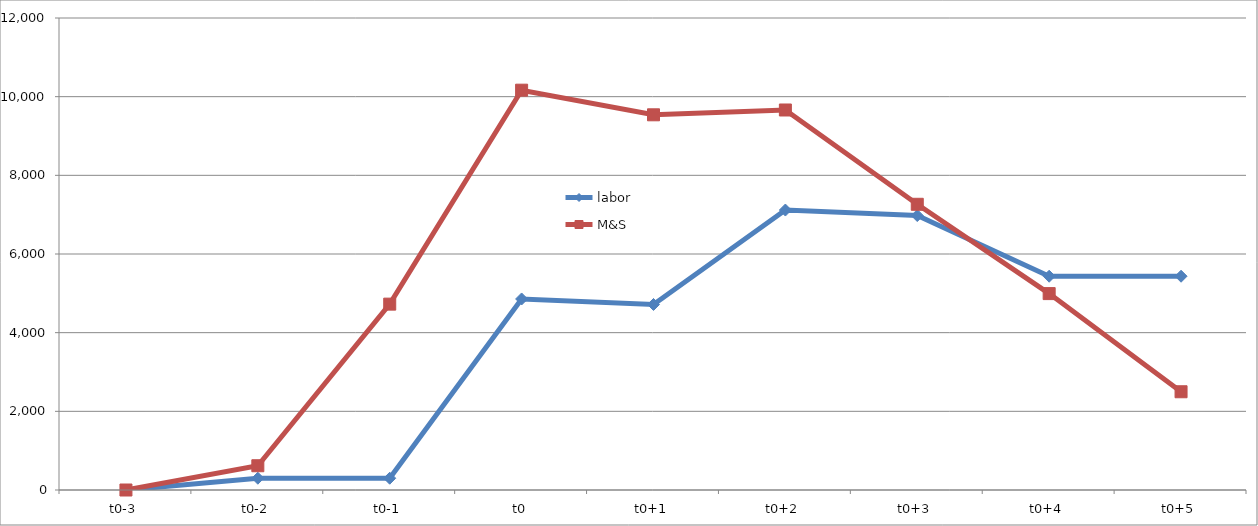
| Category | labor | M&S |
|---|---|---|
| t0-3 | 0 | 0 |
| t0-2 | 299.333 | 616.811 |
| t0-1 | 299.333 | 4725.555 |
| t0 | 4856.393 | 10164.856 |
| t0+1 | 4716.704 | 9538.9 |
| t0+2 | 7117.5 | 9661.386 |
| t0+3 | 6977.811 | 7263.93 |
| t0+4 | 5435.102 | 4993.349 |
| t0+5 | 5435.102 | 2497.646 |